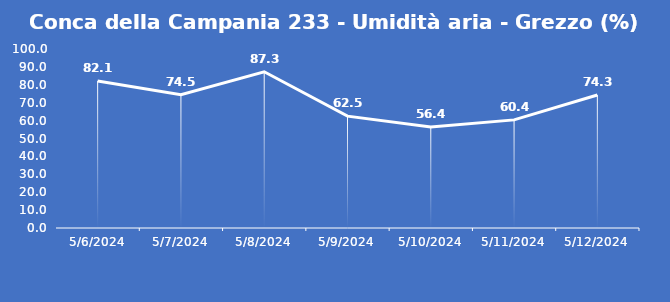
| Category | Conca della Campania 233 - Umidità aria - Grezzo (%) |
|---|---|
| 5/6/24 | 82.1 |
| 5/7/24 | 74.5 |
| 5/8/24 | 87.3 |
| 5/9/24 | 62.5 |
| 5/10/24 | 56.4 |
| 5/11/24 | 60.4 |
| 5/12/24 | 74.3 |